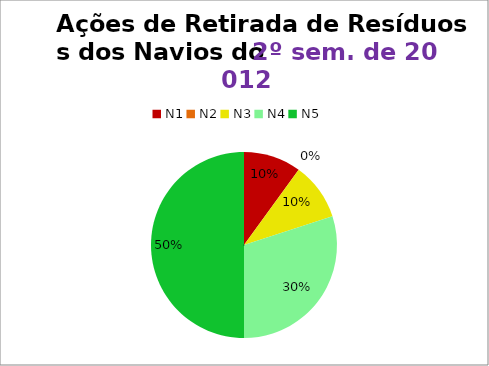
| Category | 2º/12 |
|---|---|
| N1 | 3 |
| N2 | 0 |
| N3 | 3 |
| N4 | 9 |
| N5 | 15 |